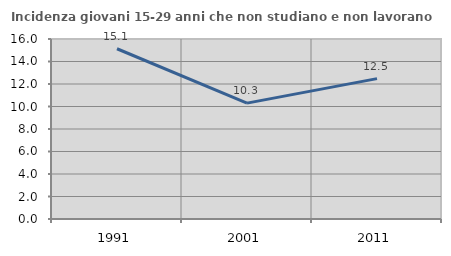
| Category | Incidenza giovani 15-29 anni che non studiano e non lavorano  |
|---|---|
| 1991.0 | 15.134 |
| 2001.0 | 10.301 |
| 2011.0 | 12.48 |